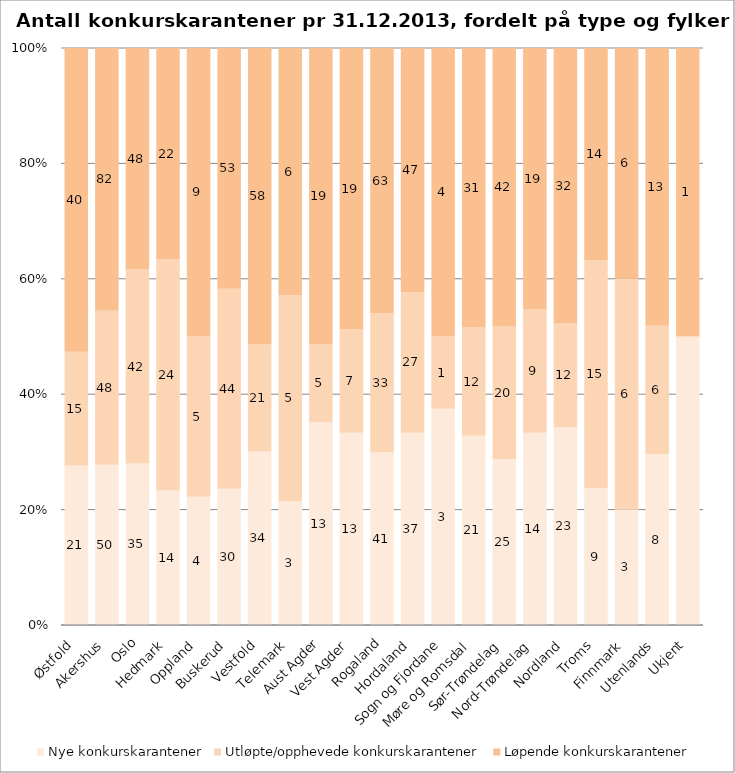
| Category | Nye konkurskarantener | Utløpte/opphevede konkurskarantener | Løpende konkurskarantener |
|---|---|---|---|
| Østfold | 21 | 15 | 40 |
| Akershus | 50 | 48 | 82 |
| Oslo | 35 | 42 | 48 |
| Hedmark | 14 | 24 | 22 |
| Oppland | 4 | 5 | 9 |
| Buskerud | 30 | 44 | 53 |
| Vestfold | 34 | 21 | 58 |
| Telemark | 3 | 5 | 6 |
| Aust Agder | 13 | 5 | 19 |
| Vest Agder | 13 | 7 | 19 |
| Rogaland | 41 | 33 | 63 |
| Hordaland | 37 | 27 | 47 |
| Sogn og Fjordane | 3 | 1 | 4 |
| Møre og Romsdal | 21 | 12 | 31 |
| Sør-Trøndelag | 25 | 20 | 42 |
| Nord-Trøndelag | 14 | 9 | 19 |
| Nordland | 23 | 12 | 32 |
| Troms | 9 | 15 | 14 |
| Finnmark | 3 | 6 | 6 |
| Utenlands | 8 | 6 | 13 |
| Ukjent | 1 | 0 | 1 |